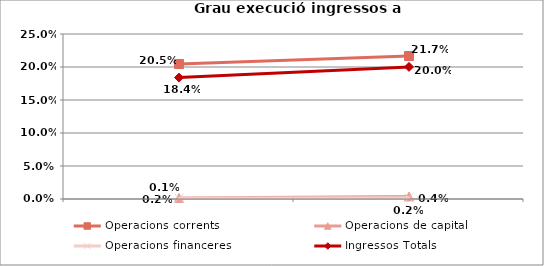
| Category | Operacions corrents | Operacions de capital | Operacions financeres | Ingressos Totals |
|---|---|---|---|---|
|  | 0.205 | 0.002 | 0.001 | 0.184 |
|  | 0.217 | 0.004 | 0.002 | 0.2 |